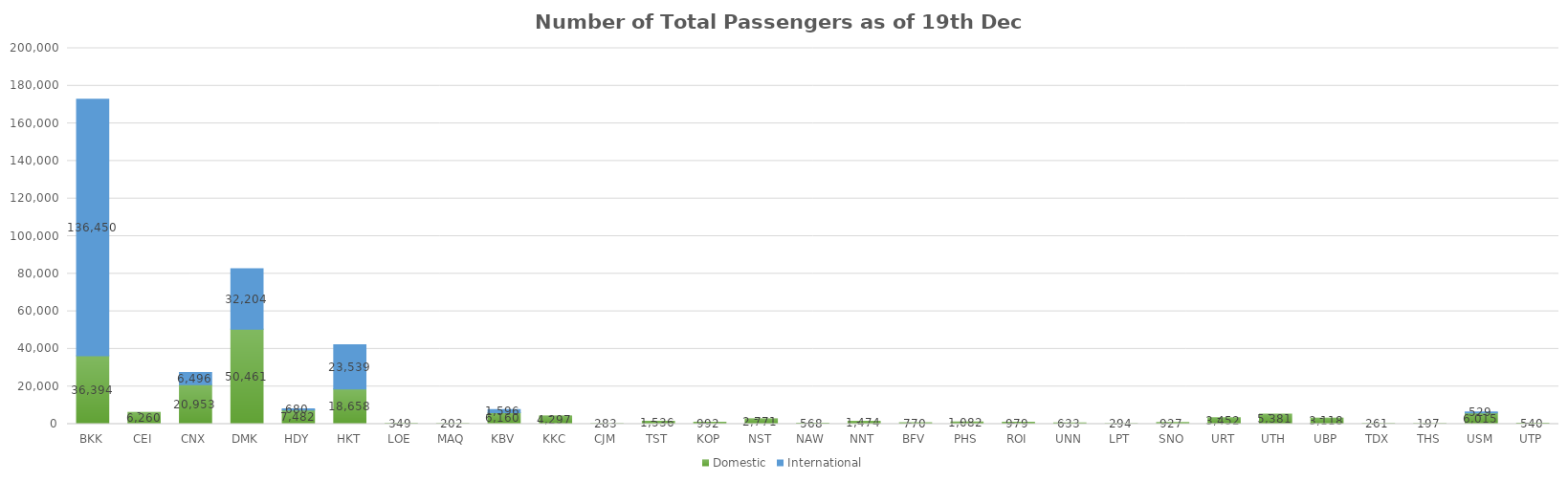
| Category | Domestic | International |
|---|---|---|
| BKK | 36394 | 136450 |
| CEI | 6260 | 0 |
| CNX | 20953 | 6496 |
| DMK | 50461 | 32204 |
| HDY | 7482 | 680 |
| HKT | 18658 | 23539 |
| LOE | 349 | 0 |
| MAQ | 202 | 0 |
| KBV | 6160 | 1596 |
| KKC | 4297 | 0 |
| CJM | 283 | 0 |
| TST | 1536 | 0 |
| KOP | 992 | 0 |
| NST | 2771 | 0 |
| NAW | 568 | 0 |
| NNT | 1474 | 0 |
| BFV | 770 | 0 |
| PHS | 1082 | 0 |
| ROI | 979 | 0 |
| UNN | 633 | 0 |
| LPT | 294 | 0 |
| SNO | 927 | 0 |
| URT | 3452 | 0 |
| UTH | 5381 | 0 |
| UBP | 3118 | 0 |
| TDX | 261 | 0 |
| THS | 197 | 0 |
| USM | 6015 | 529 |
| UTP | 540 | 0 |